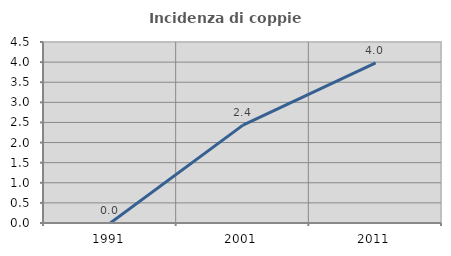
| Category | Incidenza di coppie miste |
|---|---|
| 1991.0 | 0 |
| 2001.0 | 2.434 |
| 2011.0 | 3.982 |